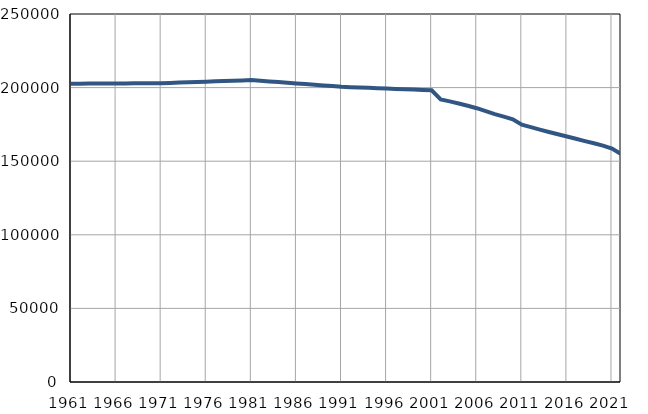
| Category | Population
size |
|---|---|
| 1961.0 | 202630 |
| 1962.0 | 202666 |
| 1963.0 | 202702 |
| 1964.0 | 202738 |
| 1965.0 | 202774 |
| 1966.0 | 202810 |
| 1967.0 | 202846 |
| 1968.0 | 202882 |
| 1969.0 | 202918 |
| 1970.0 | 202954 |
| 1971.0 | 202990 |
| 1972.0 | 203200 |
| 1973.0 | 203411 |
| 1974.0 | 203621 |
| 1975.0 | 203832 |
| 1976.0 | 204042 |
| 1977.0 | 204252 |
| 1978.0 | 204463 |
| 1979.0 | 204673 |
| 1980.0 | 204884 |
| 1981.0 | 205094 |
| 1982.0 | 204641 |
| 1983.0 | 204187 |
| 1984.0 | 203734 |
| 1985.0 | 203280 |
| 1986.0 | 202827 |
| 1987.0 | 202374 |
| 1988.0 | 201920 |
| 1989.0 | 201467 |
| 1990.0 | 201013 |
| 1991.0 | 200560 |
| 1992.0 | 200320 |
| 1993.0 | 200081 |
| 1994.0 | 199841 |
| 1995.0 | 199602 |
| 1996.0 | 199362 |
| 1997.0 | 199123 |
| 1998.0 | 198883 |
| 1999.0 | 198644 |
| 2000.0 | 198404 |
| 2001.0 | 198165 |
| 2002.0 | 191996 |
| 2003.0 | 190645 |
| 2004.0 | 189156 |
| 2005.0 | 187629 |
| 2006.0 | 186007 |
| 2007.0 | 184014 |
| 2008.0 | 182015 |
| 2009.0 | 180293 |
| 2010.0 | 178464 |
| 2011.0 | 174760 |
| 2012.0 | 173108 |
| 2013.0 | 171466 |
| 2014.0 | 169862 |
| 2015.0 | 168290 |
| 2016.0 | 166795 |
| 2017.0 | 165273 |
| 2018.0 | 163657 |
| 2019.0 | 162165 |
| 2020.0 | 160558 |
| 2021.0 | 158579 |
| 2022.0 | 154890 |